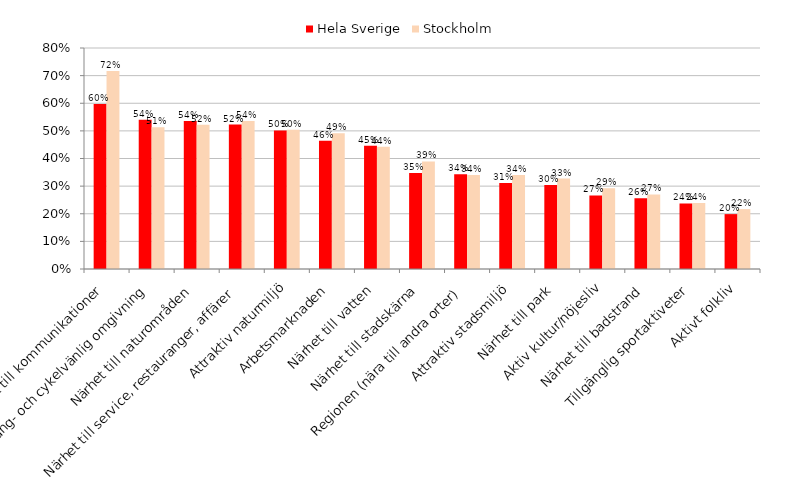
| Category | Hela Sverige | Stockholm |
|---|---|---|
| Närhet till kommunikationer | 0.597 | 0.717 |
| Gång- och cykelvänlig omgivning | 0.54 | 0.513 |
| Närhet till naturområden | 0.536 | 0.522 |
| Närhet till service, restauranger, affärer | 0.523 | 0.535 |
| Attraktiv naturmiljö | 0.501 | 0.504 |
| Arbetsmarknaden | 0.464 | 0.491 |
| Närhet till vatten | 0.446 | 0.442 |
| Närhet till stadskärna | 0.347 | 0.389 |
| Regionen (nära till andra orter) | 0.343 | 0.341 |
|  Attraktiv stadsmiljö | 0.311 | 0.341 |
| Närhet till park | 0.304 | 0.327 |
| Aktiv kultur/nöjesliv | 0.266 | 0.292 |
| Närhet till badstrand | 0.257 | 0.27 |
| Tillgänglig sportaktiveter | 0.237 | 0.239 |
| Aktivt folkliv | 0.199 | 0.217 |